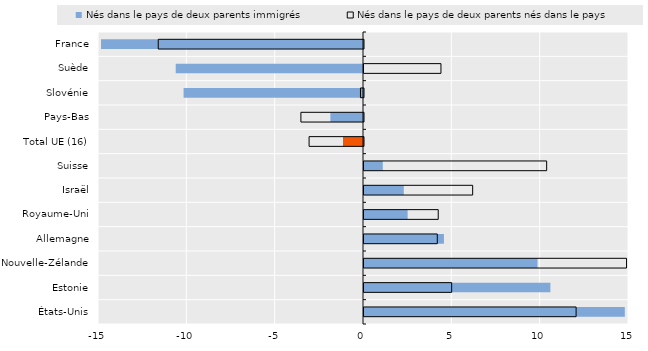
| Category | Nés dans le pays de deux parents immigrés | Nés dans le pays de deux parents nés dans le pays  |
|---|---|---|
| France | -14.829 | -11.618 |
| Suède | -10.601 | 4.356 |
| Slovénie | -10.156 | -0.172 |
| Pays-Bas | -1.847 | -3.544 |
| Total UE (16) | -1.132 | -3.08 |
| Suisse | 1.064 | 10.339 |
| Israël | 2.252 | 6.151 |
| Royaume-Uni | 2.47 | 4.202 |
| Allemagne | 4.525 | 4.148 |
| Nouvelle-Zélande | 9.821 | 14.861 |
| Estonie | 10.55 | 4.962 |
| États-Unis | 14.763 | 12.006 |